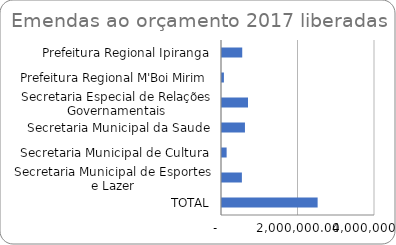
| Category | Series 0 |
|---|---|
| Prefeitura Regional Ipiranga | 529000 |
| Prefeitura Regional M'Boi Mirim | 50000 |
| Secretaria Especial de Relações Governamentais | 680000 |
| Secretaria Municipal da Saude | 600000 |
| Secretaria Municipal de Cultura | 121000 |
| Secretaria Municipal de Esportes e Lazer | 520000 |
| TOTAL | 2500000 |